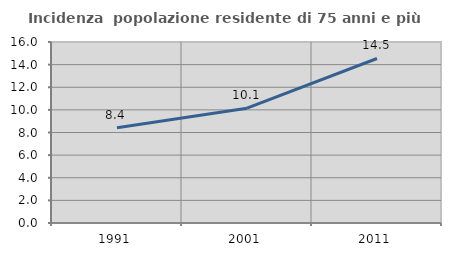
| Category | Incidenza  popolazione residente di 75 anni e più |
|---|---|
| 1991.0 | 8.419 |
| 2001.0 | 10.146 |
| 2011.0 | 14.544 |